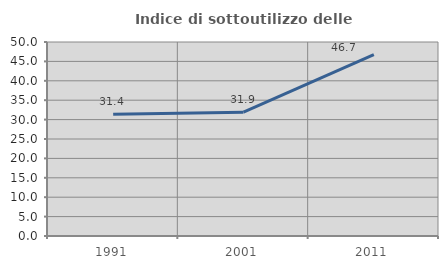
| Category | Indice di sottoutilizzo delle abitazioni  |
|---|---|
| 1991.0 | 31.399 |
| 2001.0 | 31.905 |
| 2011.0 | 46.73 |